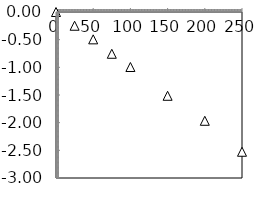
| Category | Series 2 |
|---|---|
| 0.0 | 0 |
| 25.0 | -0.248 |
| 50.0 | -0.494 |
| 75.0 | -0.755 |
| 100.0 | -0.994 |
| 150.0 | -1.514 |
| 200.0 | -1.966 |
| 250.0 | -2.526 |